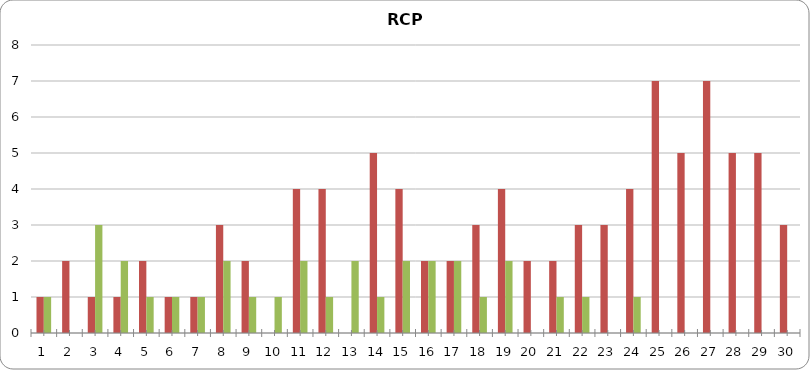
| Category | No. of H | No. of C |
|---|---|---|
| 0 | 1 | 1 |
| 1 | 2 | 0 |
| 2 | 1 | 3 |
| 3 | 1 | 2 |
| 4 | 2 | 1 |
| 5 | 1 | 1 |
| 6 | 1 | 1 |
| 7 | 3 | 2 |
| 8 | 2 | 1 |
| 9 | 0 | 1 |
| 10 | 4 | 2 |
| 11 | 4 | 1 |
| 12 | 0 | 2 |
| 13 | 5 | 1 |
| 14 | 4 | 2 |
| 15 | 2 | 2 |
| 16 | 2 | 2 |
| 17 | 3 | 1 |
| 18 | 4 | 2 |
| 19 | 2 | 0 |
| 20 | 2 | 1 |
| 21 | 3 | 1 |
| 22 | 3 | 0 |
| 23 | 4 | 1 |
| 24 | 7 | 0 |
| 25 | 5 | 0 |
| 26 | 7 | 0 |
| 27 | 5 | 0 |
| 28 | 5 | 0 |
| 29 | 3 | 0 |